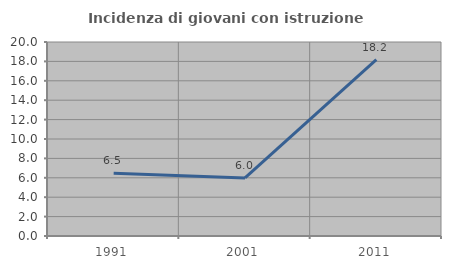
| Category | Incidenza di giovani con istruzione universitaria |
|---|---|
| 1991.0 | 6.475 |
| 2001.0 | 5.983 |
| 2011.0 | 18.182 |